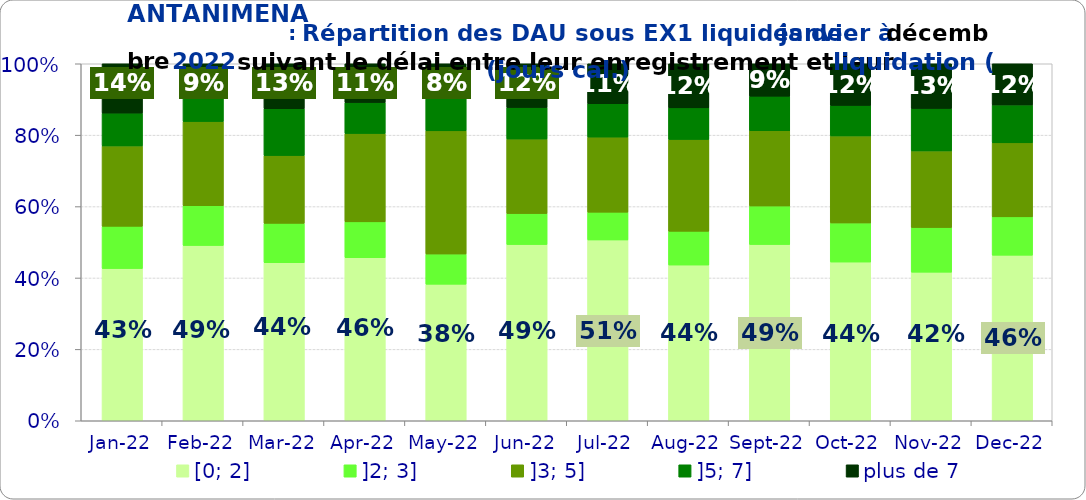
| Category | [0; 2] | ]2; 3] | ]3; 5] | ]5; 7] | plus de 7 |
|---|---|---|---|---|---|
| 2022-01-01 | 0.426 | 0.118 | 0.225 | 0.092 | 0.138 |
| 2022-02-01 | 0.491 | 0.111 | 0.236 | 0.074 | 0.088 |
| 2022-03-01 | 0.443 | 0.11 | 0.19 | 0.131 | 0.126 |
| 2022-04-01 | 0.457 | 0.1 | 0.248 | 0.087 | 0.109 |
| 2022-05-01 | 0.382 | 0.085 | 0.345 | 0.108 | 0.08 |
| 2022-06-01 | 0.494 | 0.087 | 0.209 | 0.088 | 0.123 |
| 2022-07-01 | 0.506 | 0.078 | 0.21 | 0.094 | 0.112 |
| 2022-08-01 | 0.436 | 0.095 | 0.257 | 0.088 | 0.124 |
| 2022-09-01 | 0.494 | 0.108 | 0.211 | 0.097 | 0.091 |
| 2022-10-01 | 0.445 | 0.11 | 0.244 | 0.086 | 0.117 |
| 2022-11-01 | 0.416 | 0.125 | 0.215 | 0.119 | 0.125 |
| 2022-12-01 | 0.464 | 0.107 | 0.207 | 0.106 | 0.115 |